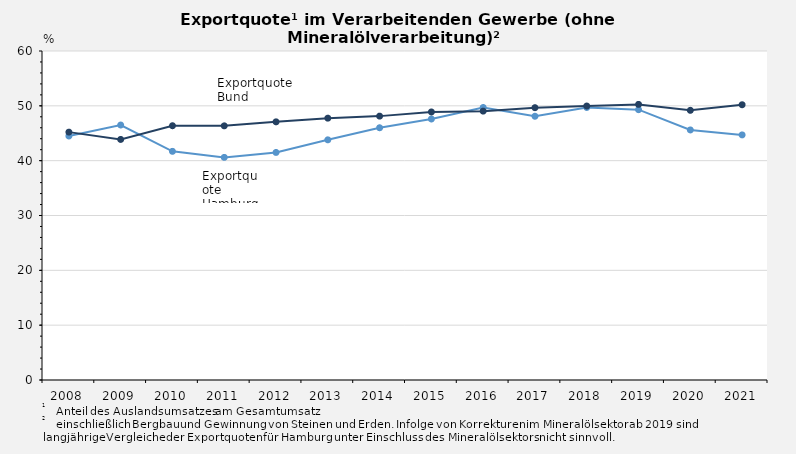
| Category | Exportquote Hamburg | Exportquote Bund |
|---|---|---|
| 2008.0 | 44.5 | 45.205 |
| 2009.0 | 46.5 | 43.874 |
| 2010.0 | 41.7 | 46.374 |
| 2011.0 | 40.6 | 46.35 |
| 2012.0 | 41.5 | 47.082 |
| 2013.0 | 43.8 | 47.753 |
| 2014.0 | 46 | 48.123 |
| 2015.0 | 47.6 | 48.885 |
| 2016.0 | 49.7 | 49.034 |
| 2017.0 | 48.1 | 49.662 |
| 2018.0 | 49.7 | 49.968 |
| 2019.0 | 49.3 | 50.264 |
| 2020.0 | 45.6 | 49.181 |
| 2021.0 | 44.7 | 50.2 |